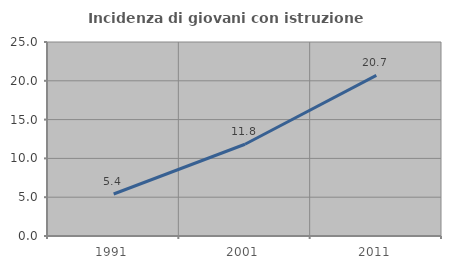
| Category | Incidenza di giovani con istruzione universitaria |
|---|---|
| 1991.0 | 5.412 |
| 2001.0 | 11.821 |
| 2011.0 | 20.704 |